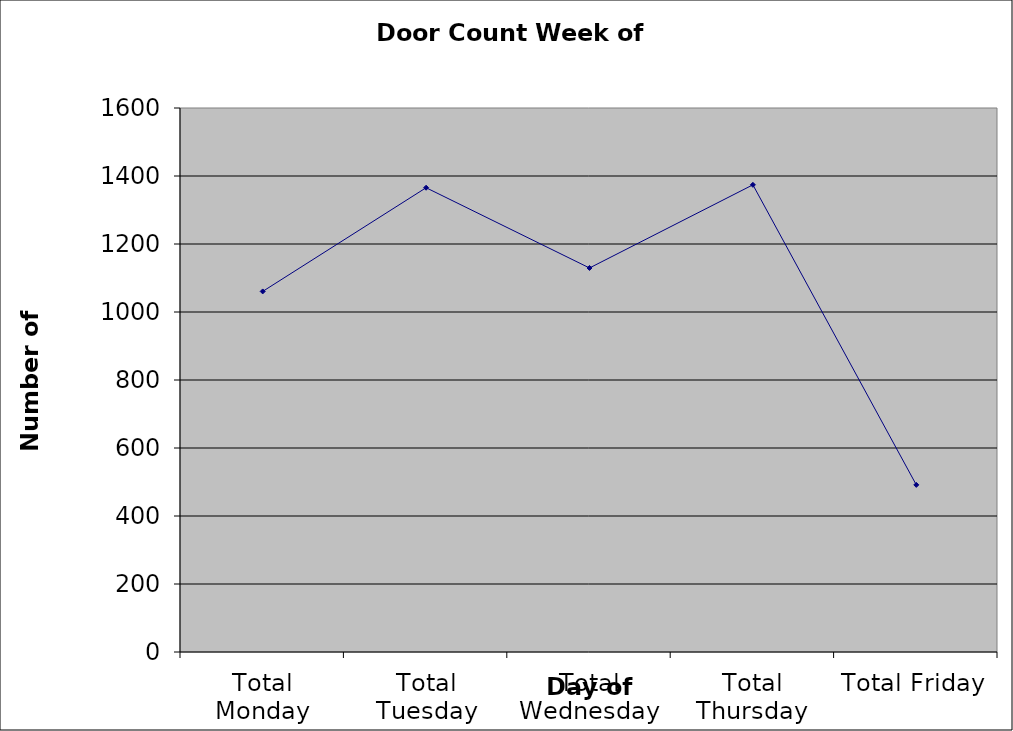
| Category | Series 0 |
|---|---|
| Total Monday | 1060.5 |
| Total Tuesday | 1365.5 |
| Total Wednesday | 1129.5 |
| Total Thursday | 1374 |
| Total Friday | 491.5 |